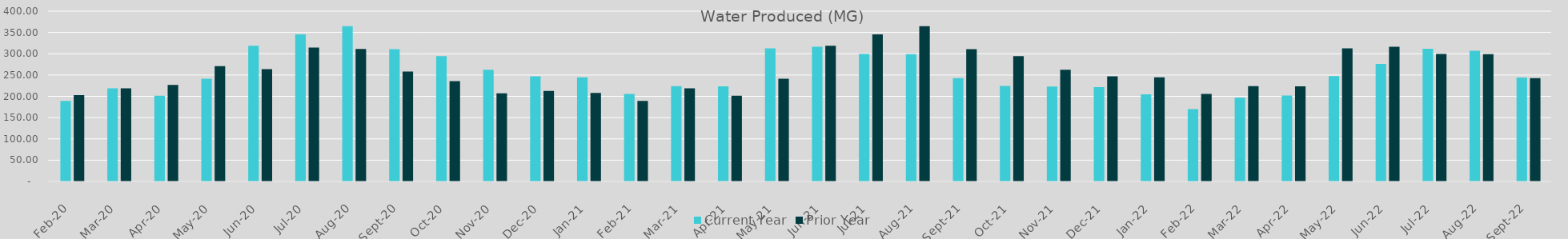
| Category | Current Year | Prior Year |
|---|---|---|
| 2020-02-01 | 189.14 | 202.92 |
| 2020-03-01 | 218.9 | 218.89 |
| 2020-04-01 | 201.4 | 226.62 |
| 2020-05-01 | 241.3 | 270.85 |
| 2020-06-01 | 318.9 | 263.67 |
| 2020-07-01 | 345.4 | 314.55 |
| 2020-08-01 | 364.8 | 311.17 |
| 2020-09-01 | 311 | 258.3 |
| 2020-10-01 | 294.3 | 235.52 |
| 2020-11-01 | 262.21 | 207.02 |
| 2020-12-01 | 246.95 | 212.652 |
| 2021-01-01 | 244.698 | 208.082 |
| 2021-02-01 | 205.51 | 189.14 |
| 2021-03-01 | 223.92 | 218.9 |
| 2021-04-01 | 223.48 | 201.4 |
| 2021-05-01 | 312.74 | 241.3 |
| 2021-06-01 | 316.23 | 318.9 |
| 2021-07-01 | 299.67 | 345.4 |
| 2021-08-01 | 299.01 | 364.8 |
| 2021-09-01 | 242.761 | 311 |
| 2021-10-01 | 224.43 | 294.3 |
| 2021-11-01 | 222.799 | 262.21 |
| 2021-12-01 | 221.476 | 246.95 |
| 2022-01-01 | 204.928 | 244.698 |
| 2022-02-01 | 170.15 | 205.51 |
| 2022-03-01 | 196.94 | 223.92 |
| 2022-04-01 | 201.87 | 223.48 |
| 2022-05-01 | 247.56 | 312.74 |
| 2022-06-01 | 275.83 | 316.23 |
| 2022-07-01 | 311.59 | 299.67 |
| 2022-08-01 | 306.95 | 299.01 |
| 2022-09-01 | 243.94 | 242.761 |